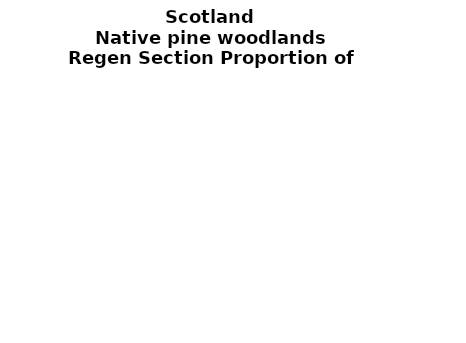
| Category | Native pine woodlands |
|---|---|
| None | 0.195 |
| Seedlings only | 0 |
| Seedlings, saplings only | 0.083 |
| Seedlings, saplings, <7 cm trees | 0.084 |
| Saplings only | 0.228 |
| <7 cm trees, seedlings only | 0 |
| <7 cm trees, saplings only | 0.231 |
| <7 cm Trees only | 0.179 |